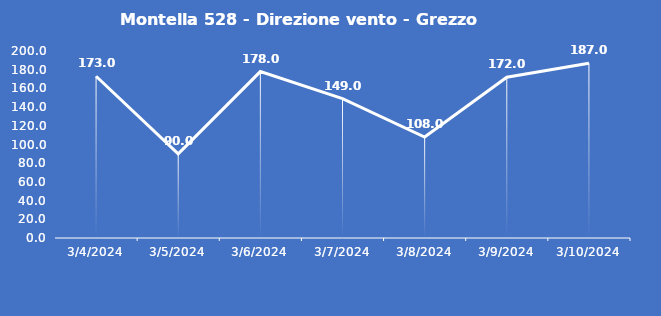
| Category | Montella 528 - Direzione vento - Grezzo (°N) |
|---|---|
| 3/4/24 | 173 |
| 3/5/24 | 90 |
| 3/6/24 | 178 |
| 3/7/24 | 149 |
| 3/8/24 | 108 |
| 3/9/24 | 172 |
| 3/10/24 | 187 |